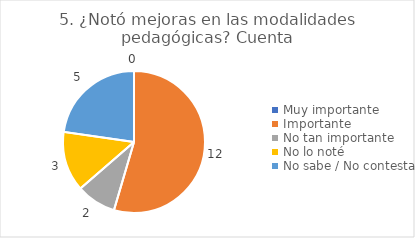
| Category | 5. ¿Notó mejoras en las modalidades pedagógicas? |
|---|---|
| Muy importante  | 0 |
| Importante  | 0.545 |
| No tan importante  | 0.091 |
| No lo noté  | 0.136 |
| No sabe / No contesta | 0.227 |